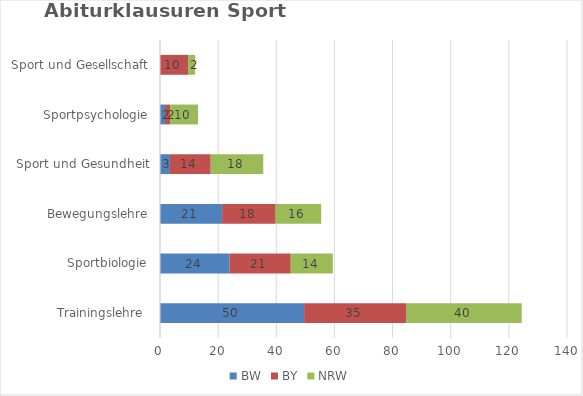
| Category | BW | BY | NRW |
|---|---|---|---|
| Trainingslehre  | 49.573 | 35.088 | 39.759 |
| Sportbiologie | 23.932 | 21.053 | 14.458 |
| Bewegungslehre | 21.368 | 18.421 | 15.663 |
| Sport und Gesundheit | 3.419 | 14.035 | 18.072 |
| Sportpsychologie | 1.709 | 1.754 | 9.639 |
| Sport und Gesellschaft | 0 | 9.649 | 2.41 |